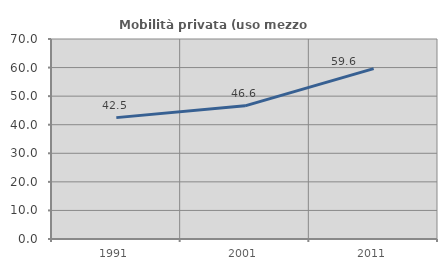
| Category | Mobilità privata (uso mezzo privato) |
|---|---|
| 1991.0 | 42.483 |
| 2001.0 | 46.611 |
| 2011.0 | 59.647 |